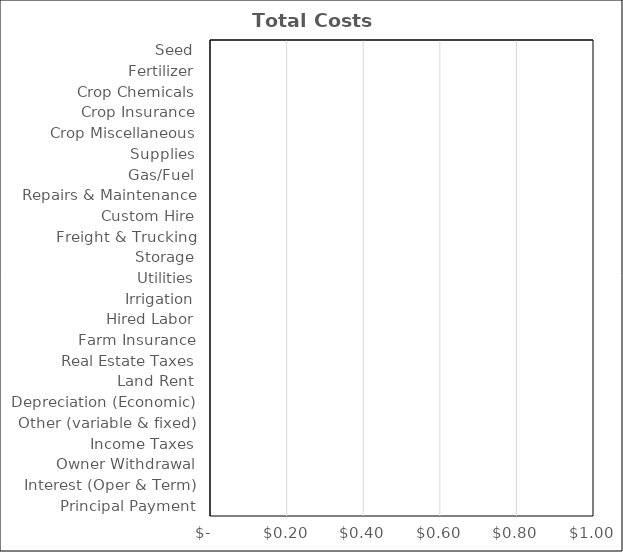
| Category | Alfalfa |
|---|---|
| Seed | 0 |
| Fertilizer | 0 |
| Crop Chemicals | 0 |
| Crop Insurance | 0 |
| Crop Miscellaneous | 0 |
| Supplies | 0 |
| Gas/Fuel | 0 |
| Repairs & Maintenance | 0 |
| Custom Hire | 0 |
| Freight & Trucking | 0 |
| Storage | 0 |
| Utilities | 0 |
| Irrigation | 0 |
| Hired Labor | 0 |
| Farm Insurance | 0 |
| Real Estate Taxes | 0 |
| Land Rent | 0 |
| Depreciation (Economic) | 0 |
| Other (variable & fixed) | 0 |
| Income Taxes | 0 |
| Owner Withdrawal | 0 |
| Interest (Oper & Term) | 0 |
| Principal Payment | 0 |